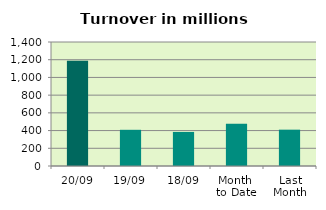
| Category | Series 0 |
|---|---|
| 20/09 | 1189.053 |
| 19/09 | 408.7 |
| 18/09 | 384.669 |
| Month 
to Date | 475.893 |
| Last
Month | 410.207 |